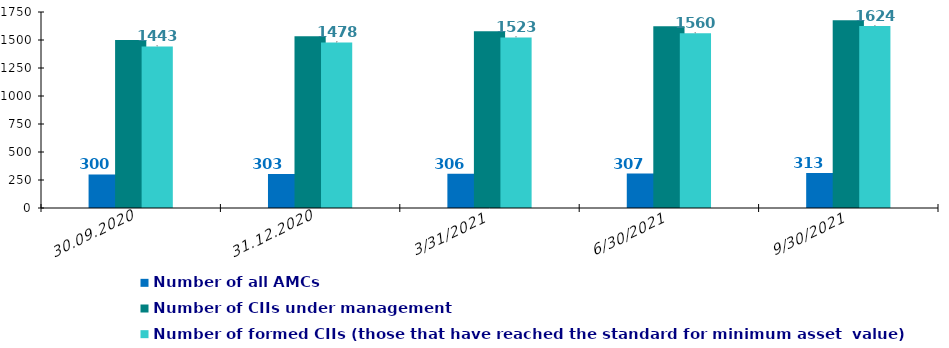
| Category | Number of all AMCs  | Number of AMCs with CII under management | Number of CIIs under management | Number of formed CIIs (those that have reached the standard for minimum asset  value) |
|---|---|---|---|---|
| 30.09.2020 | 300 |  | 1501 | 1443 |
| 31.12.2020 | 303 |  | 1533 | 1478 |
| 31.03.2021 | 306 |  | 1578 | 1523 |
| 30.06.2021 | 307 |  | 1623 | 1560 |
| 30.09.2021 | 313 |  | 1676 | 1624 |